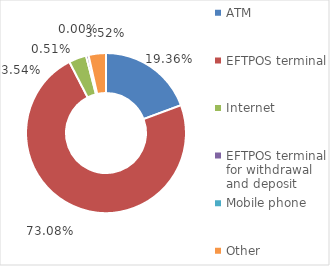
| Category | Number of transactions |
|---|---|
| ATM | 95317921 |
| EFTPOS terminal | 359939931 |
| Internet | 17422614 |
| EFTPOS terminal for withdrawal and deposit | 2503305 |
| Mobile phone | 11860 |
| Other | 17332633 |